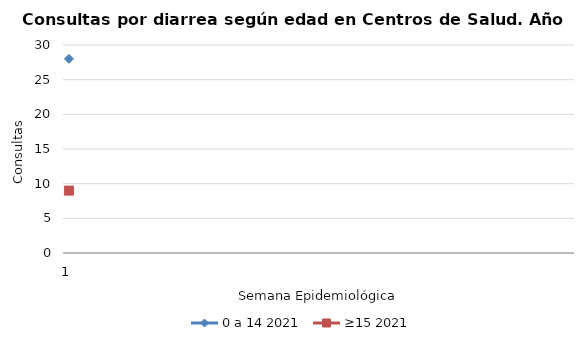
| Category | 0 a 14 2021 | ≥15 2021 |
|---|---|---|
| 1.0 | 28 | 9 |